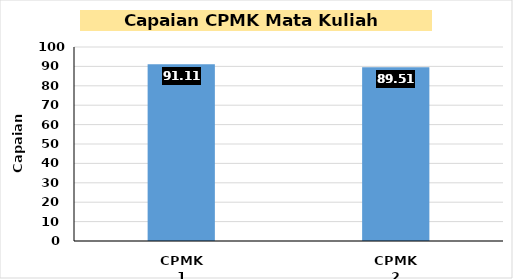
| Category | Series 0 |
|---|---|
| CPMK 1 | 91.111 |
| CPMK 2 | 89.511 |